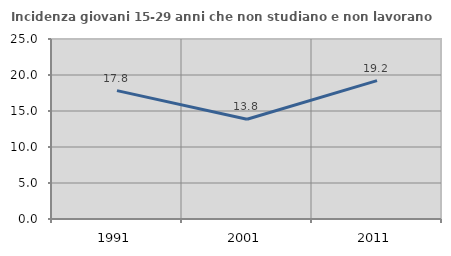
| Category | Incidenza giovani 15-29 anni che non studiano e non lavorano  |
|---|---|
| 1991.0 | 17.827 |
| 2001.0 | 13.846 |
| 2011.0 | 19.214 |